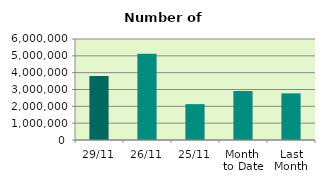
| Category | Series 0 |
|---|---|
| 29/11 | 3807574 |
| 26/11 | 5121654 |
| 25/11 | 2129568 |
| Month 
to Date | 2912429.524 |
| Last
Month | 2771381.143 |